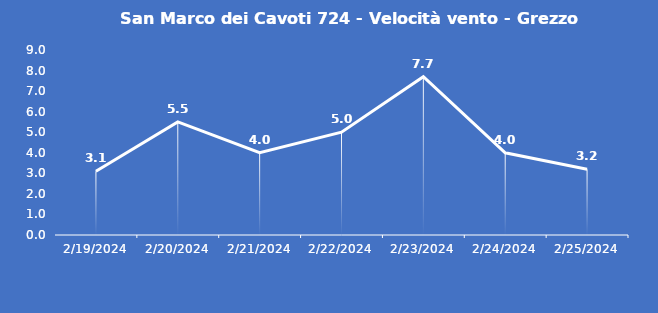
| Category | San Marco dei Cavoti 724 - Velocità vento - Grezzo (m/s) |
|---|---|
| 2/19/24 | 3.1 |
| 2/20/24 | 5.5 |
| 2/21/24 | 4 |
| 2/22/24 | 5 |
| 2/23/24 | 7.7 |
| 2/24/24 | 4 |
| 2/25/24 | 3.2 |